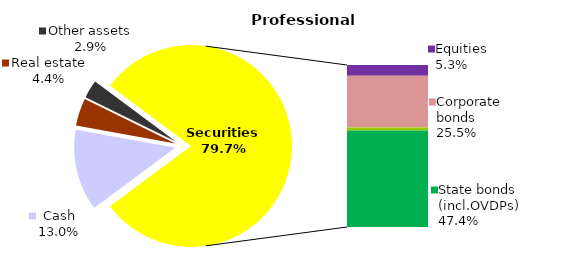
| Category | Professional |
|---|---|
| Cash | 20.651 |
| Bank metals | 0 |
| Real estate | 7.006 |
| Other assets | 4.576 |
| Equities | 8.375 |
| Corporate bonds | 40.354 |
| Municipal bonds | 2.377 |
| State bonds (incl.OVDPs) | 75.143 |